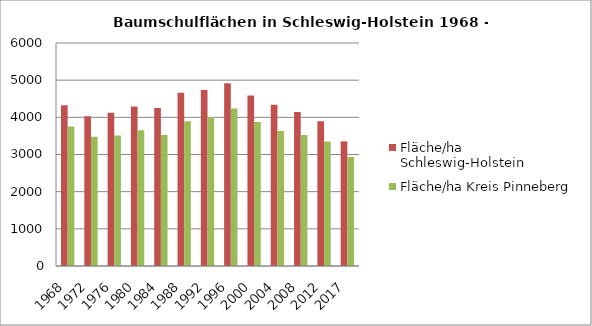
| Category | Fläche/ha Schleswig-Holstein | Fläche/ha Kreis Pinneberg |
|---|---|---|
| 1968.0 | 4324 | 3751 |
| 1972.0 | 4026 | 3478 |
| 1976.0 | 4126 | 3508 |
| 1980.0 | 4291 | 3650 |
| 1984.0 | 4251 | 3528 |
| 1988.0 | 4664 | 3893 |
| 1992.0 | 4734 | 4012 |
| 1996.0 | 4918 | 4239 |
| 2000.0 | 4587 | 3873 |
| 2004.0 | 4339 | 3629 |
| 2008.0 | 4143 | 3526 |
| 2012.0 | 3895 | 3349 |
| 2017.0 | 3354 | 2931 |